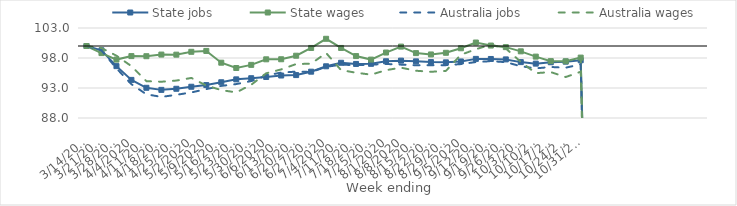
| Category | State jobs | State wages | Australia jobs | Australia wages |
|---|---|---|---|---|
| 14/03/2020 | 100 | 100 | 100 | 100 |
| 21/03/2020 | 99.285 | 98.817 | 99.261 | 99.662 |
| 28/03/2020 | 96.646 | 97.735 | 96.28 | 98.386 |
| 04/04/2020 | 94.35 | 98.316 | 93.636 | 96.64 |
| 11/04/2020 | 93.034 | 98.299 | 91.95 | 94.142 |
| 18/04/2020 | 92.689 | 98.57 | 91.517 | 94.044 |
| 25/04/2020 | 92.871 | 98.557 | 91.861 | 94.24 |
| 02/05/2020 | 93.211 | 99.033 | 92.261 | 94.675 |
| 09/05/2020 | 93.484 | 99.177 | 92.816 | 93.417 |
| 16/05/2020 | 93.956 | 97.218 | 93.349 | 92.645 |
| 23/05/2020 | 94.44 | 96.331 | 93.653 | 92.27 |
| 30/05/2020 | 94.632 | 96.856 | 94.153 | 93.543 |
| 06/06/2020 | 94.837 | 97.781 | 95.073 | 95.449 |
| 13/06/2020 | 95.079 | 97.789 | 95.572 | 96.097 |
| 20/06/2020 | 95.153 | 98.382 | 95.727 | 96.992 |
| 27/06/2020 | 95.721 | 99.674 | 95.674 | 97.05 |
| 04/07/2020 | 96.618 | 101.201 | 96.519 | 98.837 |
| 11/07/2020 | 97.205 | 99.676 | 96.892 | 95.976 |
| 18/07/2020 | 97.01 | 98.322 | 96.803 | 95.549 |
| 25/07/2020 | 97.03 | 97.734 | 96.894 | 95.223 |
| 01/08/2020 | 97.456 | 98.909 | 97.004 | 95.974 |
| 08/08/2020 | 97.561 | 99.9 | 96.893 | 96.39 |
| 15/08/2020 | 97.438 | 98.815 | 96.793 | 95.878 |
| 22/08/2020 | 97.319 | 98.591 | 96.797 | 95.7 |
| 29/08/2020 | 97.274 | 98.868 | 96.807 | 95.852 |
| 05/09/2020 | 97.422 | 99.623 | 96.983 | 98.536 |
| 12/09/2020 | 97.854 | 100.578 | 97.328 | 99.459 |
| 19/09/2020 | 97.836 | 100.074 | 97.472 | 100.228 |
| 26/09/2020 | 97.767 | 99.811 | 97.305 | 99.582 |
| 03/10/2020 | 97.314 | 99.112 | 96.626 | 97.348 |
| 10/10/2020 | 97.06 | 98.232 | 96.269 | 95.474 |
| 17/10/2020 | 97.292 | 97.478 | 96.502 | 95.648 |
| 24/10/2020 | 97.392 | 97.454 | 96.383 | 94.829 |
| 31/10/2020 | 97.617 | 98.068 | 96.953 | 95.711 |